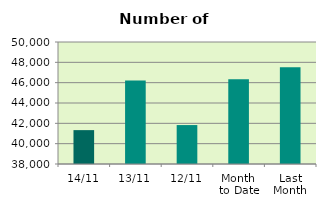
| Category | Series 0 |
|---|---|
| 14/11 | 41332 |
| 13/11 | 46206 |
| 12/11 | 41830 |
| Month 
to Date | 46325.6 |
| Last
Month | 47528 |